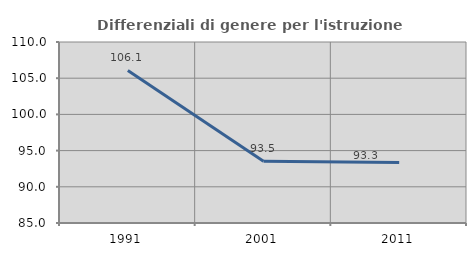
| Category | Differenziali di genere per l'istruzione superiore |
|---|---|
| 1991.0 | 106.068 |
| 2001.0 | 93.519 |
| 2011.0 | 93.34 |